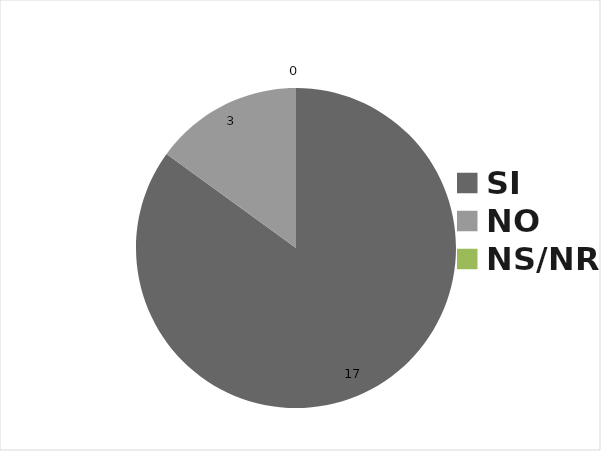
| Category | FA |
|---|---|
| SI | 17 |
| NO | 3 |
| NS/NR | 0 |